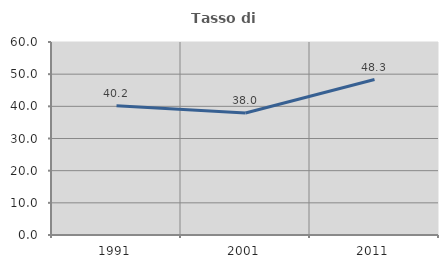
| Category | Tasso di occupazione   |
|---|---|
| 1991.0 | 40.197 |
| 2001.0 | 37.95 |
| 2011.0 | 48.333 |